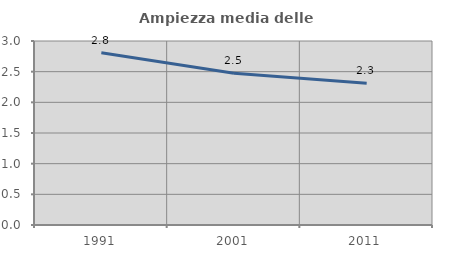
| Category | Ampiezza media delle famiglie |
|---|---|
| 1991.0 | 2.807 |
| 2001.0 | 2.476 |
| 2011.0 | 2.312 |